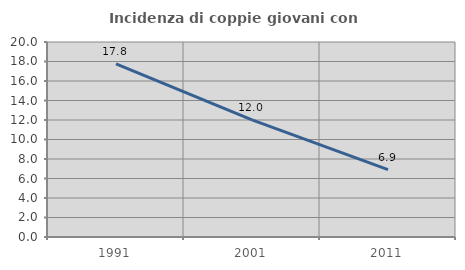
| Category | Incidenza di coppie giovani con figli |
|---|---|
| 1991.0 | 17.764 |
| 2001.0 | 12.006 |
| 2011.0 | 6.901 |